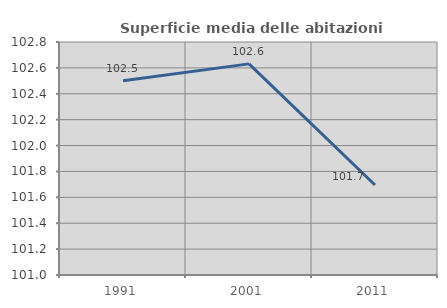
| Category | Superficie media delle abitazioni occupate |
|---|---|
| 1991.0 | 102.501 |
| 2001.0 | 102.631 |
| 2011.0 | 101.696 |